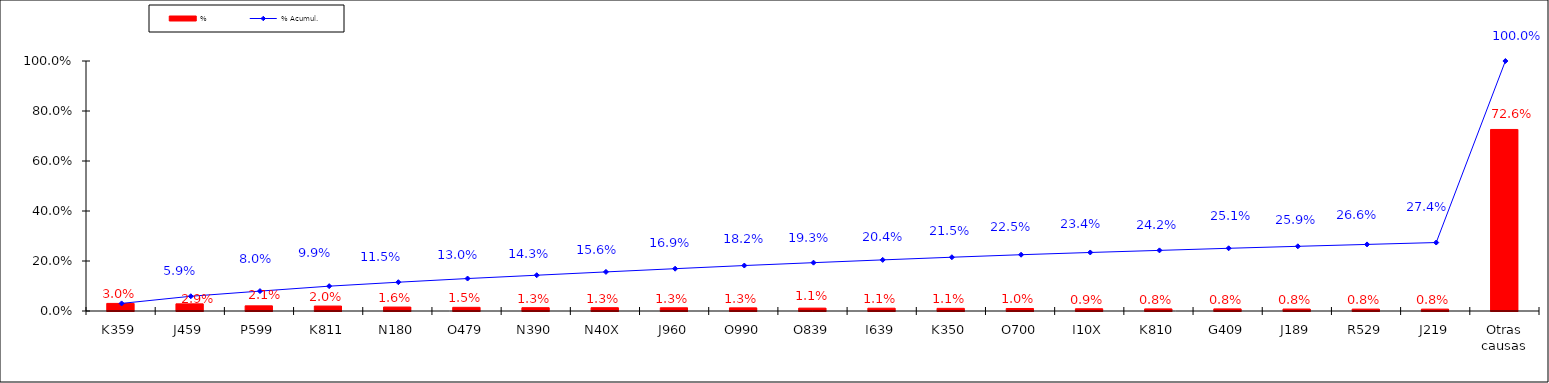
| Category | % |
|---|---|
| K359 | 0.03 |
| J459 | 0.029 |
| P599 | 0.021 |
| K811 | 0.02 |
| N180 | 0.016 |
| O479 | 0.015 |
| N390 | 0.013 |
| N40X | 0.013 |
| J960 | 0.013 |
| O990 | 0.013 |
| O839 | 0.011 |
| I639 | 0.011 |
| K350 | 0.011 |
| O700 | 0.01 |
| I10X | 0.009 |
| K810 | 0.008 |
| G409 | 0.008 |
| J189 | 0.008 |
| R529 | 0.008 |
| J219 | 0.008 |
| Otras causas | 0.726 |